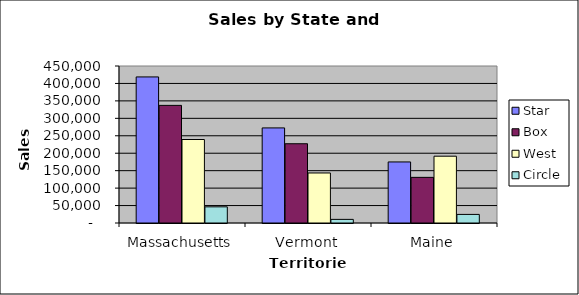
| Category | Star | Box | West | Circle |
|---|---|---|---|---|
| Massachusetts | 418679 | 337102 | 239312 | 46325 |
| Vermont | 272522 | 227150 | 143400 | 10390 |
| Maine | 175000 | 130808 | 191500 | 24615 |